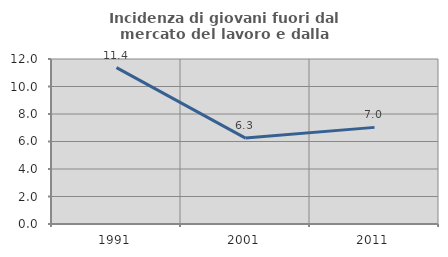
| Category | Incidenza di giovani fuori dal mercato del lavoro e dalla formazione  |
|---|---|
| 1991.0 | 11.371 |
| 2001.0 | 6.25 |
| 2011.0 | 7.027 |